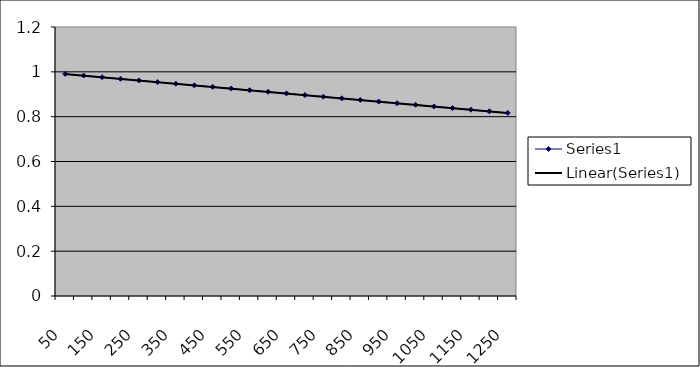
| Category | Series 0 |
|---|---|
| 50.0 | 0.991 |
| 100.0 | 0.983 |
| 150.0 | 0.976 |
| 200.0 | 0.969 |
| 250.0 | 0.962 |
| 300.0 | 0.954 |
| 350.0 | 0.947 |
| 400.0 | 0.94 |
| 450.0 | 0.933 |
| 500.0 | 0.925 |
| 550.0 | 0.918 |
| 600.0 | 0.911 |
| 650.0 | 0.904 |
| 700.0 | 0.896 |
| 750.0 | 0.889 |
| 800.0 | 0.882 |
| 850.0 | 0.875 |
| 900.0 | 0.867 |
| 950.0 | 0.86 |
| 1000.0 | 0.853 |
| 1050.0 | 0.846 |
| 1100.0 | 0.838 |
| 1150.0 | 0.831 |
| 1200.0 | 0.824 |
| 1250.0 | 0.817 |